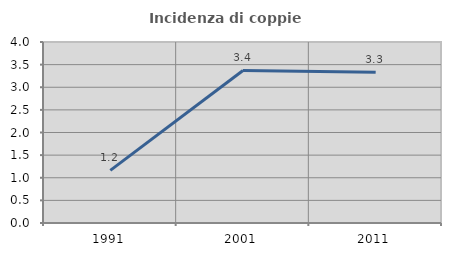
| Category | Incidenza di coppie miste |
|---|---|
| 1991.0 | 1.163 |
| 2001.0 | 3.371 |
| 2011.0 | 3.333 |